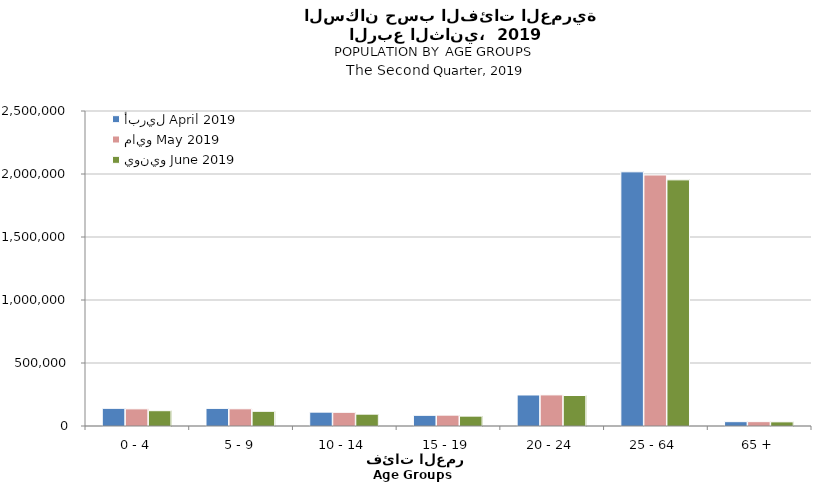
| Category | أبريل April 2019 | مايو May 2019  | يونيو June 2019  |
|---|---|---|---|
| 0 - 4 | 140252 | 135942 | 121361 |
| 5 - 9 | 139669 | 136516 | 116630 |
| 10 - 14 | 109979 | 108653 | 93975 |
| 15 - 19 | 84770 | 86104 | 78310 |
| 20 - 24 | 246111 | 246795 | 242034 |
| 25 - 64 | 2017202 | 1992085 | 1953452 |
| 65 + | 34311 | 34384 | 32895 |